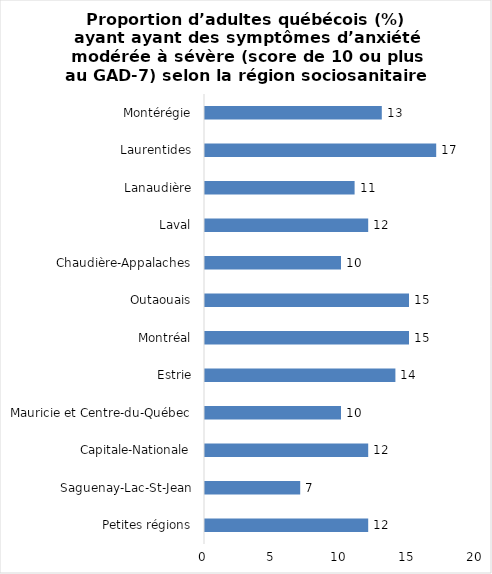
| Category | Series 0 |
|---|---|
| Petites régions | 12 |
| Saguenay-Lac-St-Jean | 7 |
| Capitale-Nationale | 12 |
| Mauricie et Centre-du-Québec | 10 |
| Estrie | 14 |
| Montréal | 15 |
| Outaouais | 15 |
| Chaudière-Appalaches | 10 |
| Laval | 12 |
| Lanaudière | 11 |
| Laurentides | 17 |
| Montérégie | 13 |